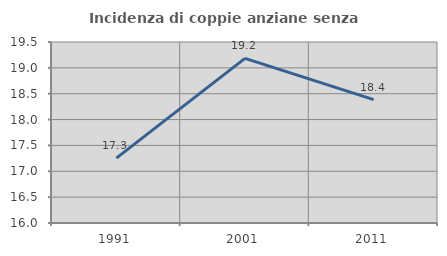
| Category | Incidenza di coppie anziane senza figli  |
|---|---|
| 1991.0 | 17.255 |
| 2001.0 | 19.184 |
| 2011.0 | 18.386 |